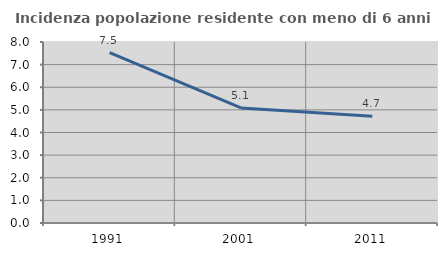
| Category | Incidenza popolazione residente con meno di 6 anni |
|---|---|
| 1991.0 | 7.53 |
| 2001.0 | 5.084 |
| 2011.0 | 4.715 |